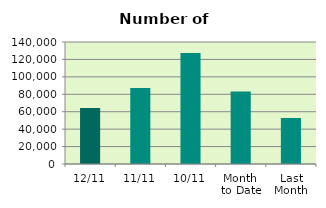
| Category | Series 0 |
|---|---|
| 12/11 | 64394 |
| 11/11 | 87252 |
| 10/11 | 127278 |
| Month 
to Date | 83093.556 |
| Last
Month | 52845 |